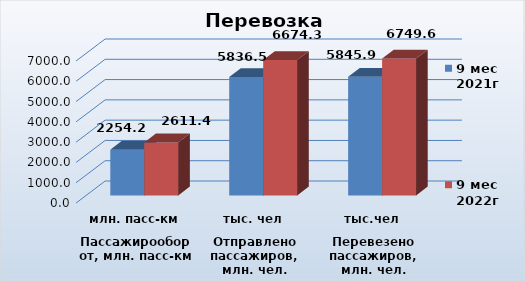
| Category | 9 мес 2021г | 9 мес 2022г |
|---|---|---|
| 0 | 2254.2 | 2611.4 |
| 1 | 5836.5 | 6674.3 |
| 2 | 5845.9 | 6749.6 |